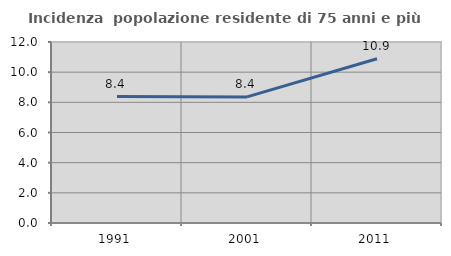
| Category | Incidenza  popolazione residente di 75 anni e più |
|---|---|
| 1991.0 | 8.382 |
| 2001.0 | 8.36 |
| 2011.0 | 10.892 |